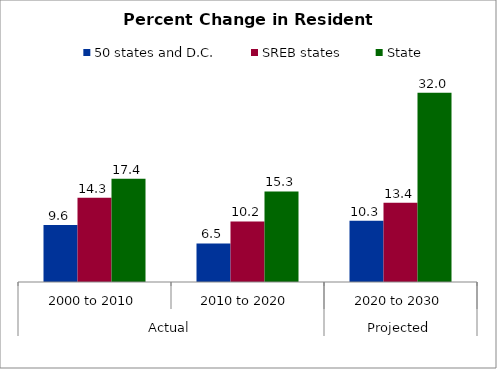
| Category | 50 states and D.C. | SREB states | State |
|---|---|---|---|
| 0 | 9.627 | 14.256 | 17.439 |
| 1 | 6.517 | 10.242 | 15.321 |
| 2 | 10.35 | 13.407 | 31.99 |